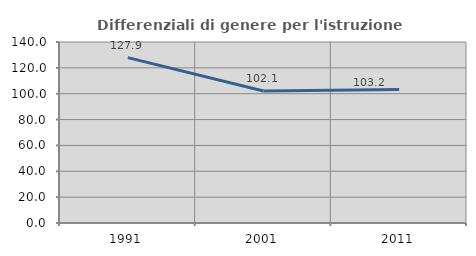
| Category | Differenziali di genere per l'istruzione superiore |
|---|---|
| 1991.0 | 127.914 |
| 2001.0 | 102.112 |
| 2011.0 | 103.171 |